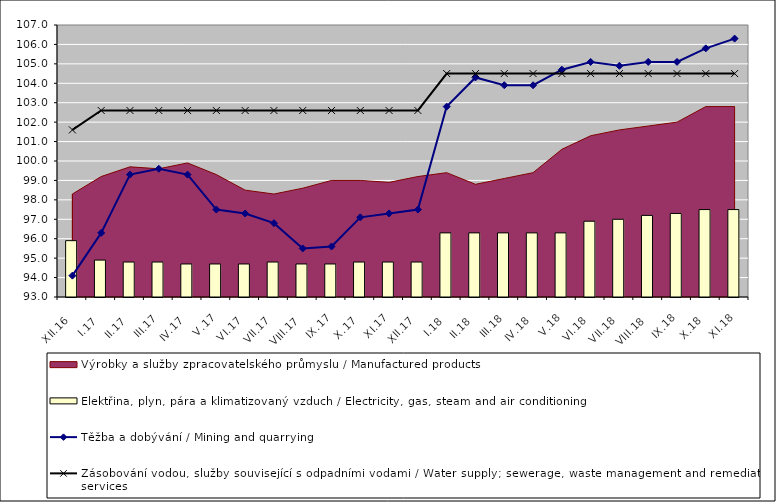
| Category | Elektřina, plyn, pára a klimatizovaný vzduch / Electricity, gas, steam and air conditioning |
|---|---|
| XII.16 | 95.9 |
| I.17 | 94.9 |
| II.17 | 94.8 |
| III.17 | 94.8 |
| IV.17 | 94.7 |
| V.17 | 94.7 |
| VI.17 | 94.7 |
| VII.17 | 94.8 |
| VIII.17 | 94.7 |
| IX.17 | 94.7 |
| X.17 | 94.8 |
| XI.17 | 94.8 |
| XII.17 | 94.8 |
| I.18 | 96.3 |
| II.18 | 96.3 |
| III.18 | 96.3 |
| IV.18 | 96.3 |
| V.18 | 96.3 |
| VI.18 | 96.9 |
| VII.18 | 97 |
| VIII.18 | 97.2 |
| IX.18 | 97.3 |
| X.18 | 97.5 |
| XI.18 | 97.5 |